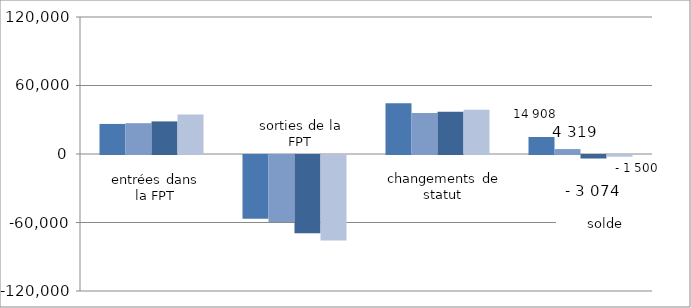
| Category | 2013-2014 | 2014-2015 | 2015-2016 | 2016-2017 |
|---|---|---|---|---|
| entrées dans la FPT | 26344 | 26983 | 28555 | 34565 |
| 0 | -55790 | -58636 | -68555 | -74877 |
| changements de statut | 44354 | 35972 | 36926 | 38812 |
| solde | 14908 | 4319 | -3074 | -1500 |